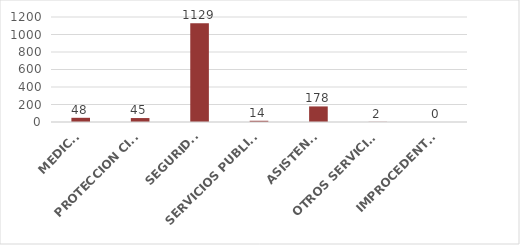
| Category | TOTAL |
|---|---|
| MEDICO | 48 |
| PROTECCION CIVIL | 45 |
| SEGURIDAD | 1129 |
| SERVICIOS PUBLICOS | 14 |
| ASISTENCIA | 178 |
| OTROS SERVICIOS | 2 |
| IMPROCEDENTES | 0 |